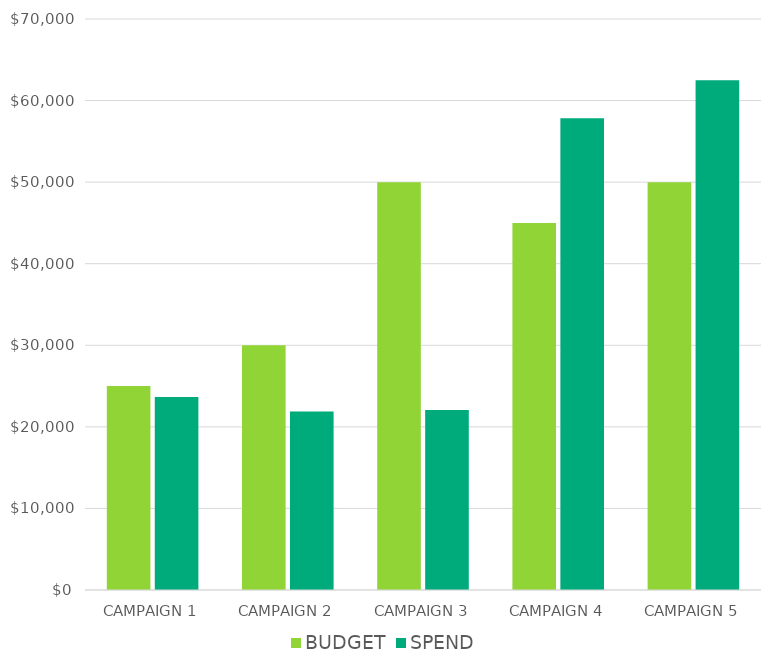
| Category | BUDGET | SPEND |
|---|---|---|
| CAMPAIGN 1 | 25000 | 23661 |
| CAMPAIGN 2 | 30000 | 21882 |
| CAMPAIGN 3 | 50000 | 22076 |
| CAMPAIGN 4 | 45000 | 57823 |
| CAMPAIGN 5 | 50000 | 62484 |